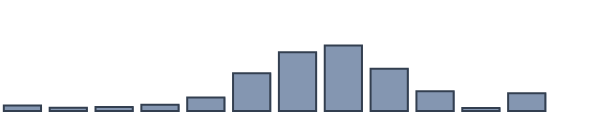
| Category | Series 0 |
|---|---|
| 0 | 2 |
| 1 | 1.174 |
| 2 | 1.478 |
| 3 | 2.217 |
| 4 | 4.87 |
| 5 | 13.609 |
| 6 | 21.174 |
| 7 | 23.609 |
| 8 | 15.261 |
| 9 | 7.087 |
| 10 | 1.087 |
| 11 | 6.435 |
| 12 | 0 |